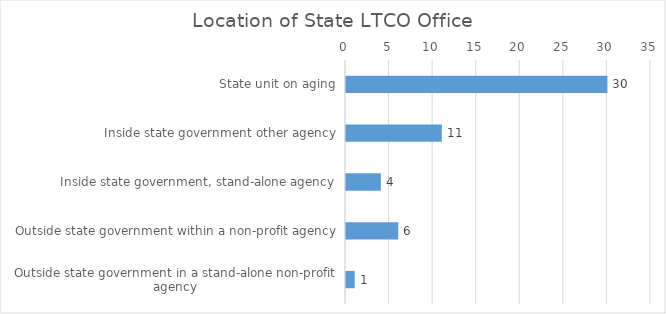
| Category | Location of State LTCO Office |
|---|---|
| State unit on aging | 30 |
| Inside state government other agency | 11 |
| Inside state government, stand-alone agency | 4 |
| Outside state government within a non-profit agency | 6 |
| Outside state government in a stand-alone non-profit agency | 1 |